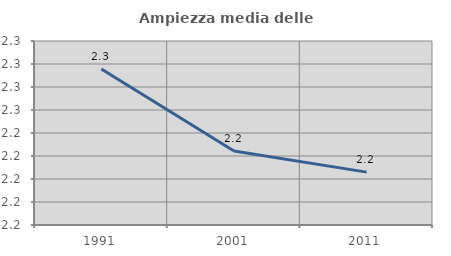
| Category | Ampiezza media delle famiglie |
|---|---|
| 1991.0 | 2.296 |
| 2001.0 | 2.224 |
| 2011.0 | 2.206 |